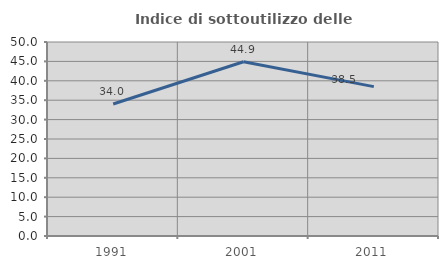
| Category | Indice di sottoutilizzo delle abitazioni  |
|---|---|
| 1991.0 | 34.014 |
| 2001.0 | 44.903 |
| 2011.0 | 38.505 |